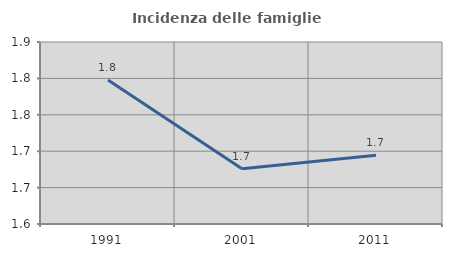
| Category | Incidenza delle famiglie numerose |
|---|---|
| 1991.0 | 1.798 |
| 2001.0 | 1.676 |
| 2011.0 | 1.694 |